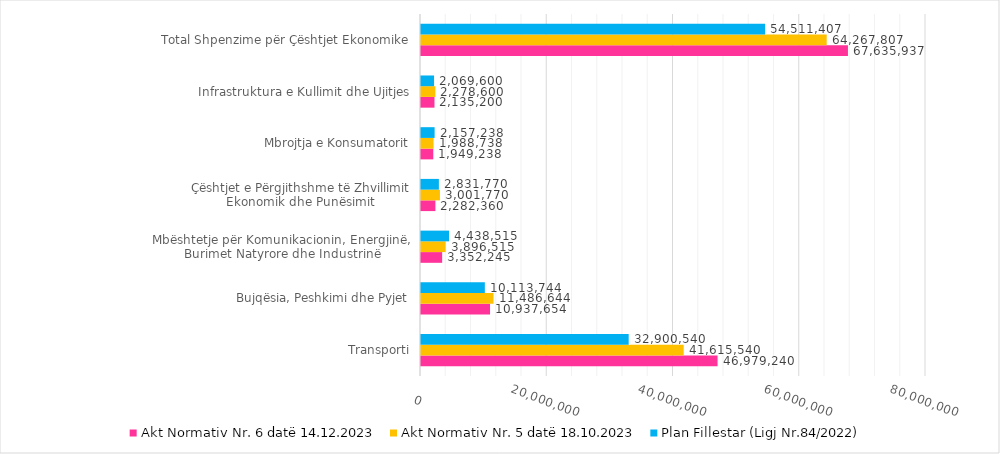
| Category | Akt Normativ Nr. 6 datë 14.12.2023 | Akt Normativ Nr. 5 datë 18.10.2023 | Plan Fillestar (Ligj Nr.84/2022) |
|---|---|---|---|
| Transporti | 46979240 | 41615540 | 32900540 |
| Bujqësia, Peshkimi dhe Pyjet | 10937654 | 11486644 | 10113744 |
| Mbështetje për Komunikacionin, Energjinë, Burimet Natyrore dhe Industrinë | 3352245 | 3896515 | 4438515 |
| Çështjet e Përgjithshme të Zhvillimit Ekonomik dhe Punësimit | 2282360 | 3001770 | 2831770 |
| Mbrojtja e Konsumatorit | 1949238 | 1988738 | 2157238 |
| Infrastruktura e Kullimit dhe Ujitjes | 2135200 | 2278600 | 2069600 |
| Total Shpenzime për Çështjet Ekonomike | 67635937 | 64267807 | 54511407 |